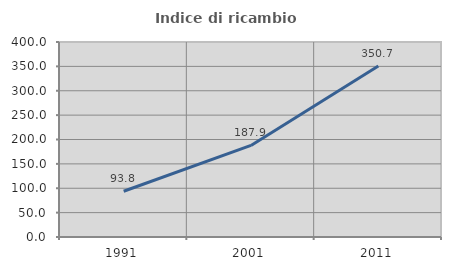
| Category | Indice di ricambio occupazionale  |
|---|---|
| 1991.0 | 93.785 |
| 2001.0 | 187.879 |
| 2011.0 | 350.685 |